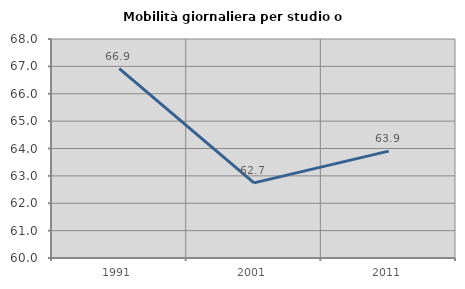
| Category | Mobilità giornaliera per studio o lavoro |
|---|---|
| 1991.0 | 66.914 |
| 2001.0 | 62.745 |
| 2011.0 | 63.904 |